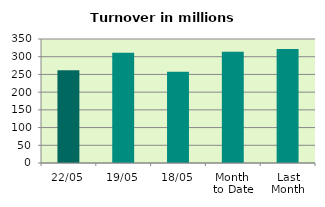
| Category | Series 0 |
|---|---|
| 22/05 | 262.114 |
| 19/05 | 310.9 |
| 18/05 | 257.848 |
| Month 
to Date | 314.106 |
| Last
Month | 322.024 |